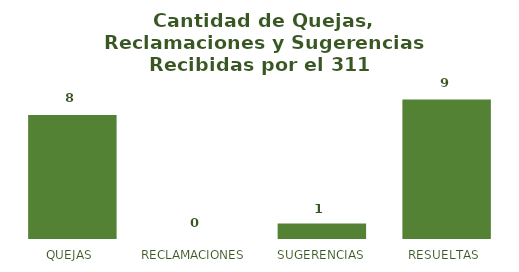
| Category | CANTIDAD |
|---|---|
| QUEJAS  | 8 |
| RECLAMACIONES  | 0 |
| SUGERENCIAS | 1 |
| RESUELTAS  | 9 |